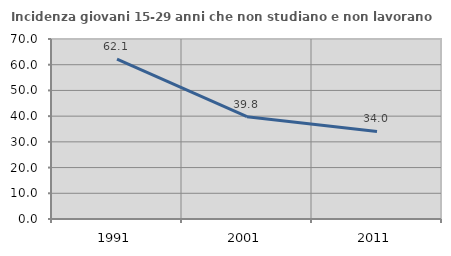
| Category | Incidenza giovani 15-29 anni che non studiano e non lavorano  |
|---|---|
| 1991.0 | 62.135 |
| 2001.0 | 39.801 |
| 2011.0 | 34.031 |